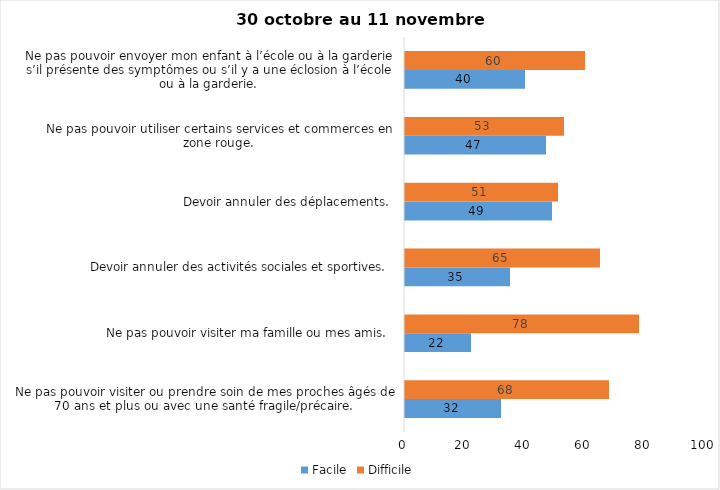
| Category | Facile | Difficile |
|---|---|---|
| Ne pas pouvoir visiter ou prendre soin de mes proches âgés de 70 ans et plus ou avec une santé fragile/précaire.  | 32 | 68 |
| Ne pas pouvoir visiter ma famille ou mes amis.  | 22 | 78 |
| Devoir annuler des activités sociales et sportives.  | 35 | 65 |
| Devoir annuler des déplacements.  | 49 | 51 |
| Ne pas pouvoir utiliser certains services et commerces en zone rouge.  | 47 | 53 |
| Ne pas pouvoir envoyer mon enfant à l’école ou à la garderie s’il présente des symptômes ou s’il y a une éclosion à l’école ou à la garderie.  | 40 | 60 |